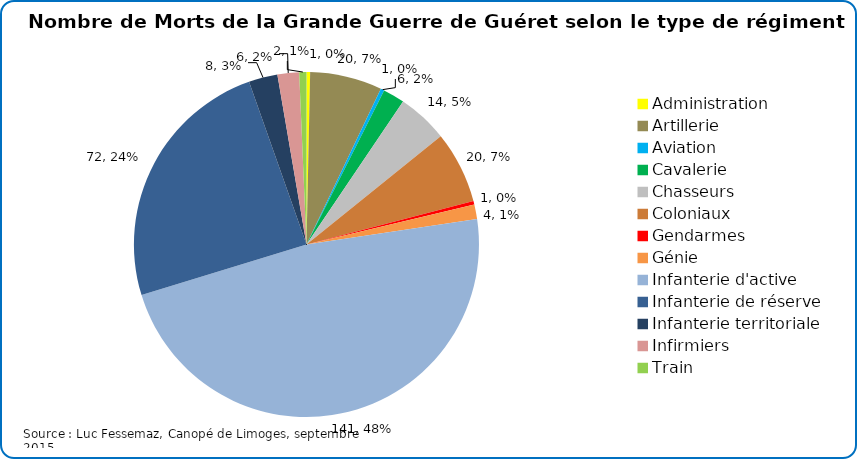
| Category | Nombre de Morts de la Grande Guerre de Guéret selon le type de régiment |
|---|---|
| Administration | 1 |
| Artillerie | 20 |
| Aviation | 1 |
| Cavalerie | 6 |
| Chasseurs | 14 |
| Coloniaux | 20 |
| Gendarmes | 1 |
| Génie | 4 |
| Infanterie d'active | 141 |
| Infanterie de réserve | 72 |
| Infanterie territoriale | 8 |
| Infirmiers | 6 |
| Train | 2 |